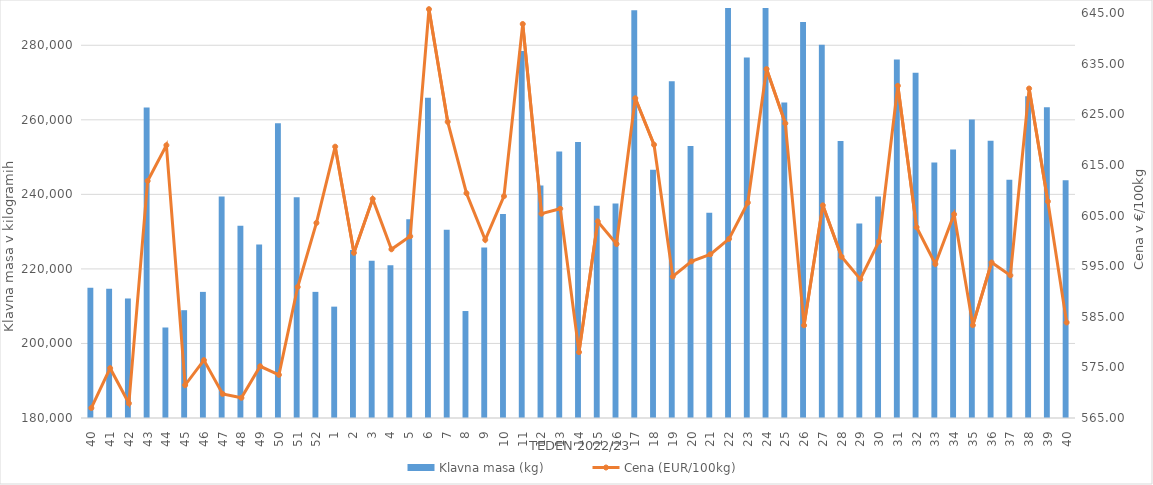
| Category | Klavna masa (kg) |
|---|---|
| 40.0 | 214936 |
| 41.0 | 214672 |
| 42.0 | 212066 |
| 43.0 | 263287 |
| 44.0 | 204280 |
| 45.0 | 208920 |
| 46.0 | 213836 |
| 47.0 | 239417 |
| 48.0 | 231565 |
| 49.0 | 226575 |
| 50.0 | 259073 |
| 51.0 | 239211 |
| 52.0 | 213841 |
| 1.0 | 209877 |
| 2.0 | 225045 |
| 3.0 | 222198 |
| 4.0 | 221002 |
| 5.0 | 233306 |
| 6.0 | 265944 |
| 7.0 | 230531 |
| 8.0 | 208699 |
| 9.0 | 225712 |
| 10.0 | 234762 |
| 11.0 | 278467 |
| 12.0 | 242369 |
| 13.0 | 251507 |
| 14.0 | 254072 |
| 15.0 | 236964 |
| 16.0 | 237552 |
| 17.0 | 289400 |
| 18.0 | 246616 |
| 19.0 | 270374 |
| 20.0 | 252984 |
| 21.0 | 235060 |
| 22.0 | 290816 |
| 23.0 | 276702 |
| 24.0 | 292976 |
| 25.0 | 264669 |
| 26.0 | 286237 |
| 27.0 | 280112 |
| 28.0 | 254336 |
| 29.0 | 232178 |
| 30.0 | 239437 |
| 31.0 | 276163 |
| 32.0 | 272647 |
| 33.0 | 248536 |
| 34.0 | 252050 |
| 35.0 | 260110 |
| 36.0 | 254389 |
| 37.0 | 243933 |
| 38.0 | 266321 |
| 39.0 | 263346 |
| 40.0 | 243765 |